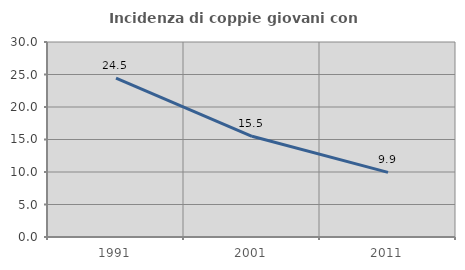
| Category | Incidenza di coppie giovani con figli |
|---|---|
| 1991.0 | 24.458 |
| 2001.0 | 15.494 |
| 2011.0 | 9.946 |